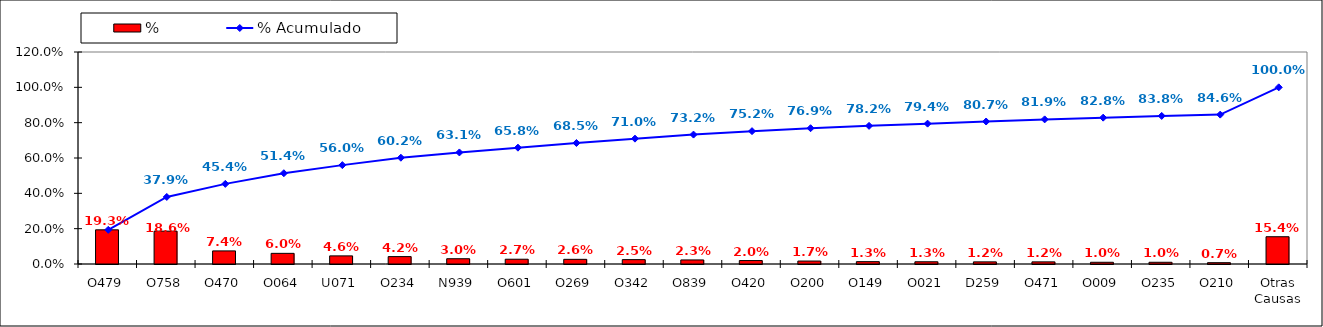
| Category | % |
|---|---|
| O479 | 0.193 |
| O758 | 0.186 |
| O470 | 0.074 |
| O064 | 0.06 |
| U071 | 0.046 |
| O234 | 0.042 |
| N939 | 0.03 |
| O601 | 0.027 |
| O269 | 0.026 |
| O342 | 0.025 |
| O839 | 0.023 |
| O420 | 0.02 |
| O200 | 0.017 |
| O149 | 0.013 |
| O021 | 0.013 |
| D259 | 0.012 |
| O471 | 0.012 |
| O009 | 0.01 |
| O235 | 0.01 |
| O210 | 0.007 |
| Otras Causas | 0.154 |